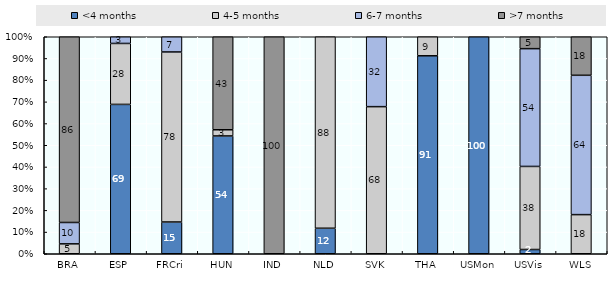
| Category | <4 months | 4-5 months | 6-7 months | >7 months |
|---|---|---|---|---|
| BRA | 0 | 4.559 | 9.853 | 85.588 |
| ESP | 68.827 | 28.086 | 3.086 | 0 |
| FRCri | 14.634 | 78.354 | 7.012 | 0 |
| HUN | 54.286 | 2.857 | 0 | 42.857 |
| IND | 0 | 0 | 0 | 100 |
| NLD | 11.755 | 88.245 | 0 | 0 |
| SVK | 0 | 67.785 | 32.215 | 0 |
| THA | 91.226 | 8.774 | 0 | 0 |
| USMon | 100 | 0 | 0 | 0 |
| USVis | 1.952 | 38.29 | 54.275 | 5.483 |
| WLS | 0 | 18.033 | 64.208 | 17.76 |